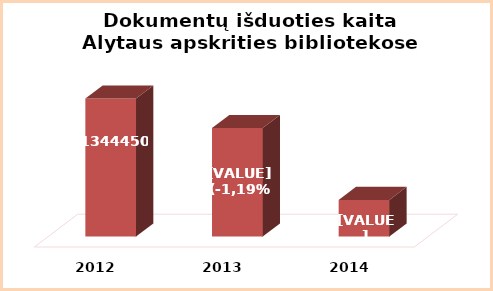
| Category | Series 0 |
|---|---|
| 2012.0 | 1344450 |
| 2013.0 | 1328531 |
| 2014.0 | 1289790 |